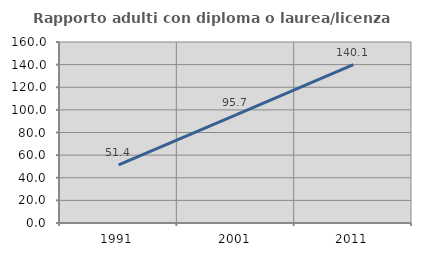
| Category | Rapporto adulti con diploma o laurea/licenza media  |
|---|---|
| 1991.0 | 51.356 |
| 2001.0 | 95.659 |
| 2011.0 | 140.061 |